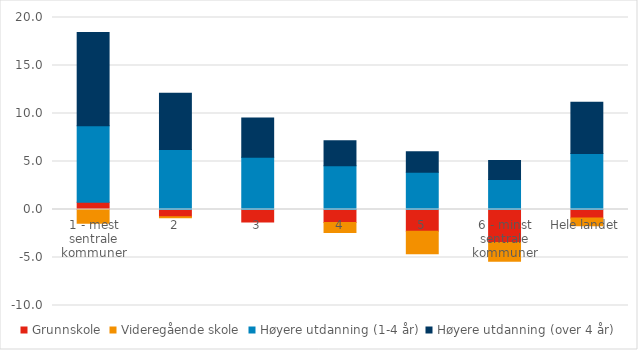
| Category | Grunnskole | Videregående skole | Høyere utdanning (1-4 år) | Høyere utdanning (over 4 år) |
|---|---|---|---|---|
| 1 - mest sentrale kommuner | 0.757 | -1.427 | 7.964 | 9.719 |
| 2 | -0.765 | -0.09 | 6.261 | 5.849 |
| 3 | -1.293 | 0.005 | 5.441 | 4.074 |
| 4 | -1.348 | -1.05 | 4.546 | 2.621 |
| 5 | -2.275 | -2.324 | 3.87 | 2.156 |
| 6 - minst sentrale kommuner | -3.444 | -1.952 | 3.119 | 1.973 |
| Hele landet | -0.887 | -0.794 | 5.844 | 5.321 |